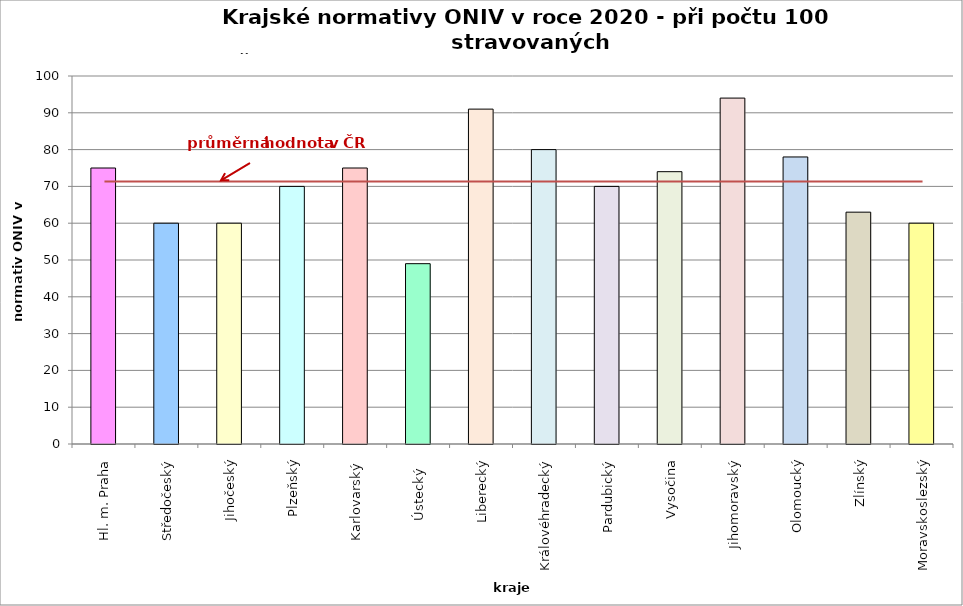
| Category | Series 0 |
|---|---|
| Hl. m. Praha | 75 |
| Středočeský | 60 |
| Jihočeský | 60 |
| Plzeňský | 70 |
| Karlovarský  | 75 |
| Ústecký   | 49 |
| Liberecký | 91 |
| Královéhradecký | 80 |
| Pardubický | 70 |
| Vysočina | 74 |
| Jihomoravský | 94 |
| Olomoucký | 78 |
| Zlínský | 63 |
| Moravskoslezský | 60 |